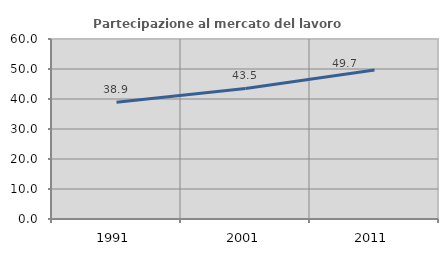
| Category | Partecipazione al mercato del lavoro  femminile |
|---|---|
| 1991.0 | 38.943 |
| 2001.0 | 43.506 |
| 2011.0 | 49.664 |